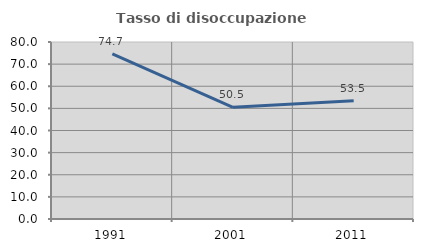
| Category | Tasso di disoccupazione giovanile  |
|---|---|
| 1991.0 | 74.679 |
| 2001.0 | 50.455 |
| 2011.0 | 53.5 |